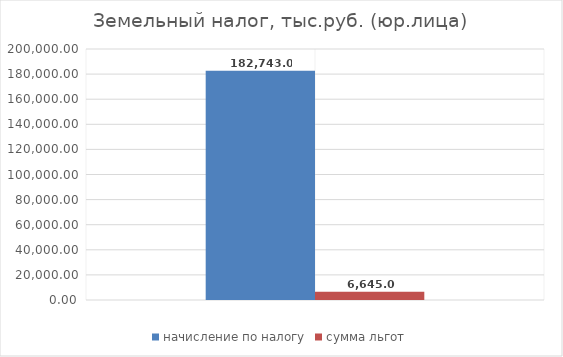
| Category | начисление по налогу | сумма льгот |
|---|---|---|
| 0 | 182743 | 6645 |